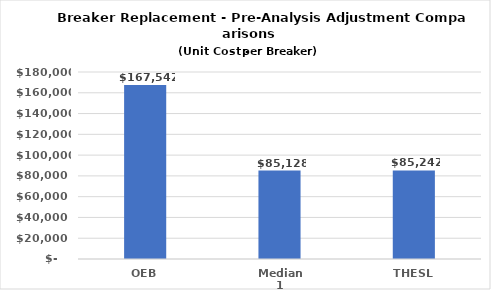
| Category | Series 0 |
|---|---|
| OEB | 167542 |
| Median 1 | 85127.738 |
| THESL | 85242 |